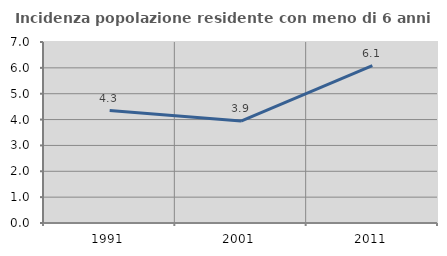
| Category | Incidenza popolazione residente con meno di 6 anni |
|---|---|
| 1991.0 | 4.348 |
| 2001.0 | 3.944 |
| 2011.0 | 6.084 |